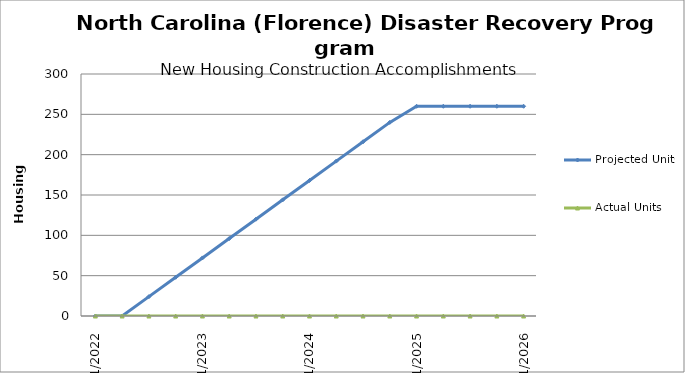
| Category | Projected Units | Actual Units |
|---|---|---|
| 1/2022 | 0 | 0 |
| 4/2022 | 0 | 0 |
| 7/2022 | 24 | 0 |
| 10/2022 | 48 | 0 |
| 1/2023 | 72 | 0 |
| 4/2023 | 96 | 0 |
| 7/2023 | 120 | 0 |
| 10/2023 | 144 | 0 |
| 1/2024 | 168 | 0 |
| 4/2024 | 192 | 0 |
| 7/2024 | 216 | 0 |
| 10/2024 | 240 | 0 |
| 1/2025 | 260 | 0 |
| 4/2025 | 260 | 0 |
| 7/2025 | 260 | 0 |
| 10/2025 | 260 | 0 |
| 1/2026 | 260 | 0 |